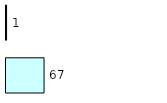
| Category | Series 0 | Series 1 |
|---|---|---|
| 0 | 67 | 1 |